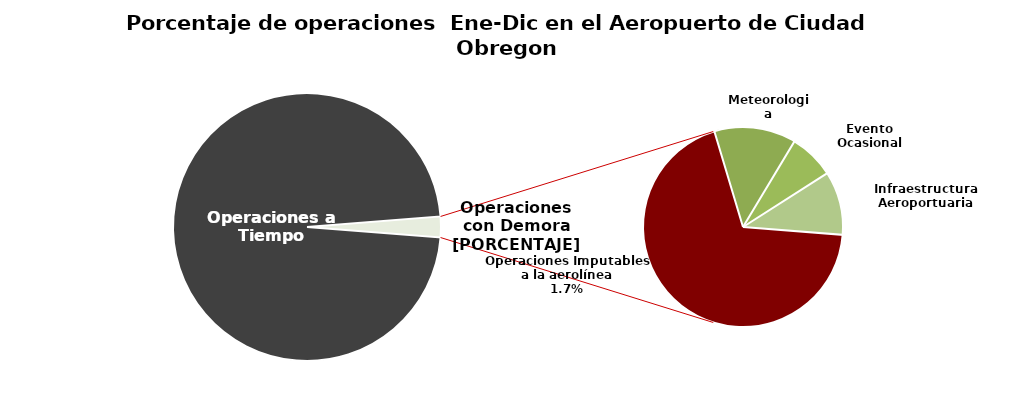
| Category | Series 0 |
|---|---|
| Operaciones a Tiempo | 2644 |
| Operaciones Imputables a la aerolínea | 47 |
| Meteorologia | 9 |
| Evento Ocasional | 5 |
| Infraestructura Aeroportuaria | 7 |